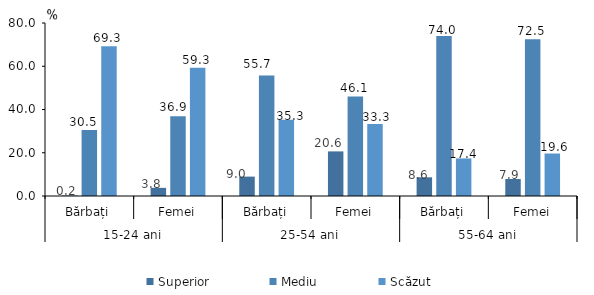
| Category | Superior | Mediu | Scăzut |
|---|---|---|---|
| 0 | 0.243 | 30.498 | 69.259 |
| 1 | 3.77 | 36.886 | 59.343 |
| 2 | 8.967 | 55.734 | 35.299 |
| 3 | 20.624 | 46.054 | 33.321 |
| 4 | 8.643 | 73.975 | 17.381 |
| 5 | 7.875 | 72.483 | 19.642 |